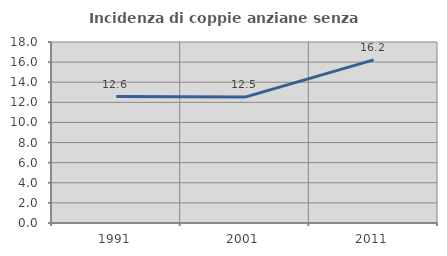
| Category | Incidenza di coppie anziane senza figli  |
|---|---|
| 1991.0 | 12.569 |
| 2001.0 | 12.522 |
| 2011.0 | 16.221 |